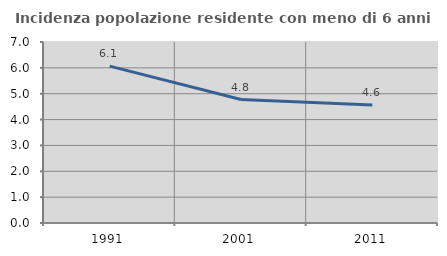
| Category | Incidenza popolazione residente con meno di 6 anni |
|---|---|
| 1991.0 | 6.069 |
| 2001.0 | 4.775 |
| 2011.0 | 4.559 |